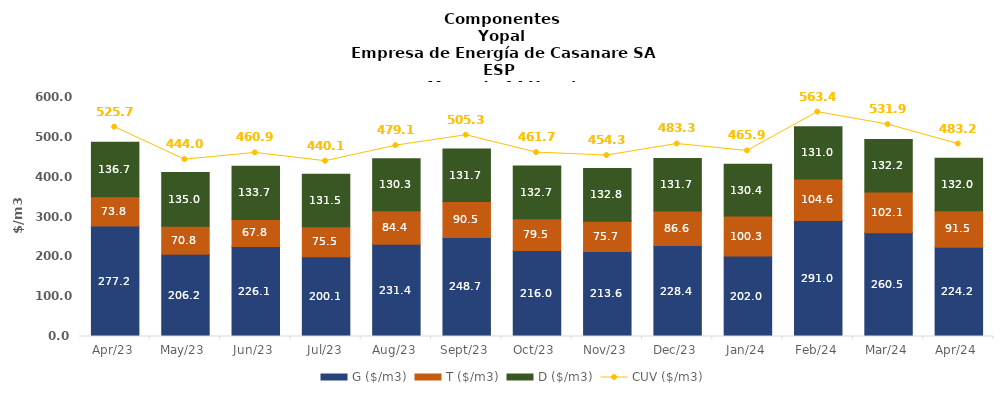
| Category | G ($/m3) | T ($/m3) | D ($/m3) |
|---|---|---|---|
| 2023-04-01 | 277.158 | 73.848 | 136.749 |
| 2023-05-01 | 206.218 | 70.832 | 134.954 |
| 2023-06-01 | 226.097 | 67.766 | 133.705 |
| 2023-07-01 | 200.103 | 75.481 | 131.466 |
| 2023-08-01 | 231.393 | 84.415 | 130.283 |
| 2023-09-01 | 248.694 | 90.492 | 131.705 |
| 2023-10-01 | 216.024 | 79.542 | 132.704 |
| 2023-11-01 | 213.555 | 75.682 | 132.796 |
| 2023-12-01 | 228.438 | 86.567 | 131.735 |
| 2024-01-01 | 202.024 | 100.31 | 130.386 |
| 2024-02-01 | 291.046 | 104.565 | 131.038 |
| 2024-03-01 | 260.536 | 102.102 | 132.174 |
| 2024-04-01 | 224.182 | 91.523 | 131.997 |